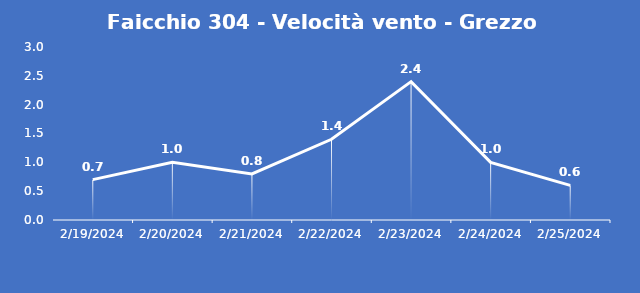
| Category | Faicchio 304 - Velocità vento - Grezzo (m/s) |
|---|---|
| 2/19/24 | 0.7 |
| 2/20/24 | 1 |
| 2/21/24 | 0.8 |
| 2/22/24 | 1.4 |
| 2/23/24 | 2.4 |
| 2/24/24 | 1 |
| 2/25/24 | 0.6 |